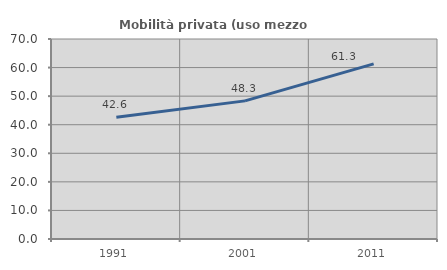
| Category | Mobilità privata (uso mezzo privato) |
|---|---|
| 1991.0 | 42.575 |
| 2001.0 | 48.344 |
| 2011.0 | 61.293 |